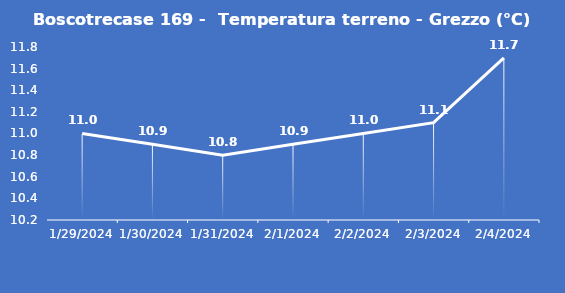
| Category | Boscotrecase 169 -  Temperatura terreno - Grezzo (°C) |
|---|---|
| 1/29/24 | 11 |
| 1/30/24 | 10.9 |
| 1/31/24 | 10.8 |
| 2/1/24 | 10.9 |
| 2/2/24 | 11 |
| 2/3/24 | 11.1 |
| 2/4/24 | 11.7 |